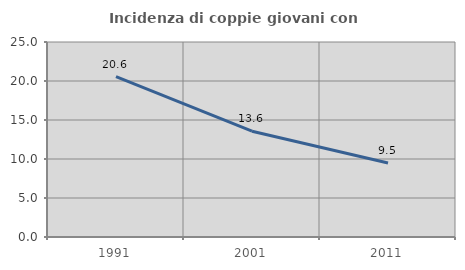
| Category | Incidenza di coppie giovani con figli |
|---|---|
| 1991.0 | 20.556 |
| 2001.0 | 13.565 |
| 2011.0 | 9.481 |